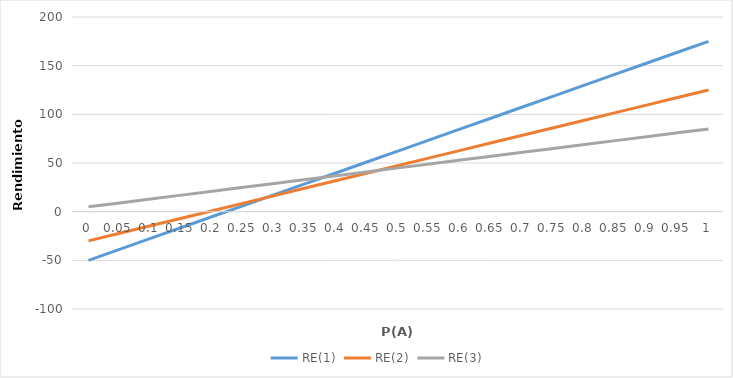
| Category | RE(1) | RE(2) | RE(3) |
|---|---|---|---|
| 0.0 | -50 | -30 | 5 |
| 0.05 | -38.75 | -22.25 | 9 |
| 0.1 | -27.5 | -14.5 | 13 |
| 0.15 | -16.25 | -6.75 | 17 |
| 0.2 | -5 | 1 | 21 |
| 0.25 | 6.25 | 8.75 | 25 |
| 0.3 | 17.5 | 16.5 | 29 |
| 0.35 | 28.75 | 24.25 | 33 |
| 0.4 | 40 | 32 | 37 |
| 0.45 | 51.25 | 39.75 | 41 |
| 0.5 | 62.5 | 47.5 | 45 |
| 0.55 | 73.75 | 55.25 | 49 |
| 0.6 | 85 | 63 | 53 |
| 0.65 | 96.25 | 70.75 | 57 |
| 0.7 | 107.5 | 78.5 | 61 |
| 0.75 | 118.75 | 86.25 | 65 |
| 0.8 | 130 | 94 | 69 |
| 0.85 | 141.25 | 101.75 | 73 |
| 0.9 | 152.5 | 109.5 | 77 |
| 0.95 | 163.75 | 117.25 | 81 |
| 1.0 | 175 | 125 | 85 |